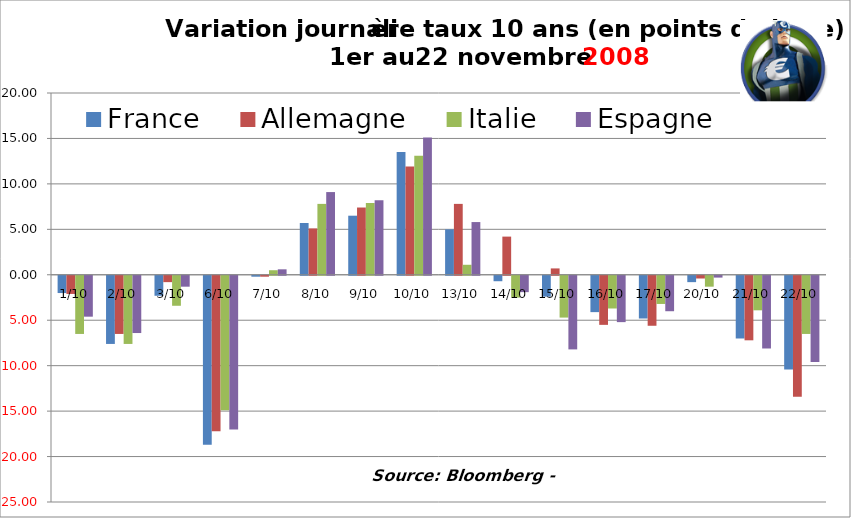
| Category | France | Allemagne | Italie | Espagne |
|---|---|---|---|---|
| 2008-10-01 | -1.9 | -2 | -6.4 | -4.5 |
| 2008-10-02 | -7.5 | -6.4 | -7.5 | -6.3 |
| 2008-10-03 | -2.2 | -0.7 | -3.3 | -1.2 |
| 2008-10-06 | -18.6 | -17.1 | -14.8 | -16.9 |
| 2008-10-07 | -0.1 | -0.1 | 0.5 | 0.6 |
| 2008-10-08 | 5.7 | 5.1 | 7.8 | 9.1 |
| 2008-10-09 | 6.5 | 7.4 | 7.9 | 8.2 |
| 2008-10-10 | 13.5 | 11.9 | 13.1 | 15.1 |
| 2008-10-13 | 5 | 7.8 | 1.1 | 5.8 |
| 2008-10-14 | -0.6 | 4.2 | -2.4 | -1.8 |
| 2008-10-15 | -2.3 | 0.7 | -4.6 | -8.1 |
| 2008-10-16 | -4 | -5.4 | -3.6 | -5.1 |
| 2008-10-17 | -4.7 | -5.5 | -3.1 | -3.9 |
| 2008-10-20 | -0.7 | -0.3 | -1.2 | -0.2 |
| 2008-10-21 | -6.9 | -7.1 | -3.8 | -8 |
| 2008-10-22 | -10.3 | -13.3 | -6.4 | -9.5 |